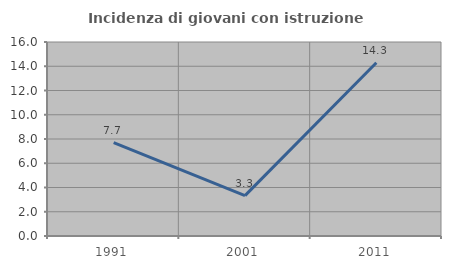
| Category | Incidenza di giovani con istruzione universitaria |
|---|---|
| 1991.0 | 7.692 |
| 2001.0 | 3.333 |
| 2011.0 | 14.286 |